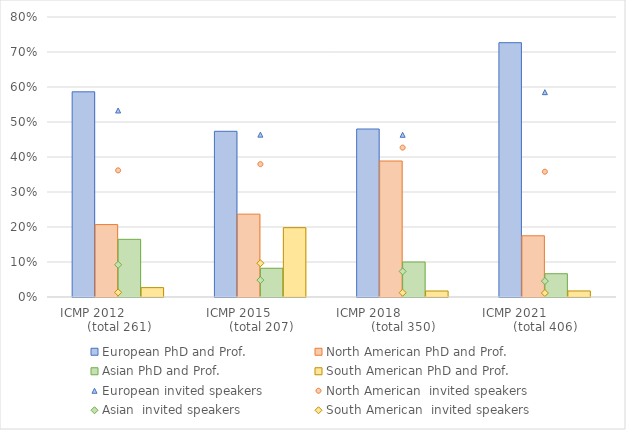
| Category | European PhD and Prof. | North American PhD and Prof. | Asian PhD and Prof. | South American PhD and Prof. |
|---|---|---|---|---|
| ICMP 2012               (total 261) | 0.586 | 0.207 | 0.165 | 0.027 |
| ICMP 2015             (total 207) | 0.473 | 0.237 | 0.082 | 0.198 |
| ICMP 2018                   (total 350) | 0.48 | 0.389 | 0.1 | 0.017 |
| ICMP 2021                 (total 406) | 0.727 | 0.175 | 0.067 | 0.017 |